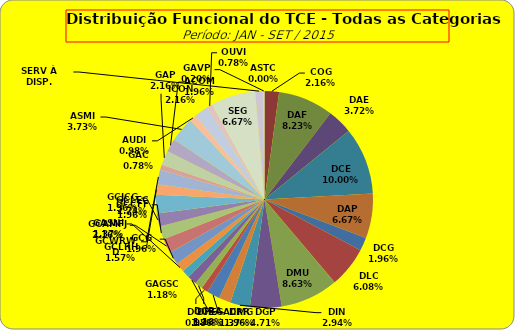
| Category | ASTC COG DAF DAE DCE DAP DCG DLC DMU DGP DIN DPE DRR DGCE DGPA GACMG GAGSC GASNI GCG GCAMFJ GCCFF GCJCG GCLEC GCLRH GCWRWD GAC GAP ACOM ASMI AUDI ICON OUVI SEG SERV À DISP. GAVP |
|---|---|
| ASTC | 0 |
| COG | 11 |
| DAF | 42 |
| DAE | 19 |
| DCE | 51 |
| DAP | 34 |
| DCG | 10 |
| DLC | 31 |
| DMU | 44 |
| DGP | 24 |
| DIN | 15 |
| DPE | 9 |
| DRR | 10 |
| DGCE | 5 |
| DGPA | 6 |
| GACMG | 7 |
| GAGSC | 6 |
| GASNI | 7 |
| GCG | 10 |
| GCAMFJ | 11 |
| GCCFF | 10 |
| GCJCG | 10 |
| GCLEC | 14 |
| GCLRH | 8 |
| GCWRWD | 11 |
| GAC | 4 |
| GAP | 11 |
| ACOM | 10 |
| ASMI | 19 |
| AUDI | 5 |
| ICON | 11 |
| OUVI | 4 |
| SEG | 34 |
| SERV À DISP. | 6 |
| GAVP | 1 |